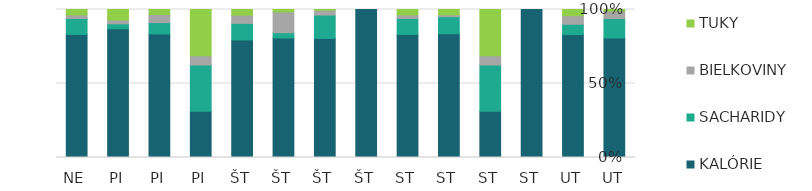
| Category | KALÓRIE | SACHARIDY | BIELKOVINY | TUKY |
|---|---|---|---|---|
| UT | 283 | 46 | 18 | 3.5 |
| UT | 500 | 42 | 35 | 25 |
| ST | 1 | 0 | 0 | 0 |
| ST | 10 | 10 | 2 | 10 |
| ST | 189 | 26 | 3 | 8 |
| ST | 477 | 62 | 13.5 | 21 |
| ŠT | 1 | 0 | 0 | 0 |
| ŠT | 245 | 48 | 10 | 1.5 |
| ŠT | 247 | 11 | 43 | 5 |
| ŠT | 456 | 64 | 32 | 22 |
| PI | 10 | 10 | 2 | 10 |
| PI | 135 | 12.36 | 8.81 | 5.51 |
| PI | 184 | 7 | 5.43 | 15 |
| NE | 477 | 62 | 13.5 | 21 |